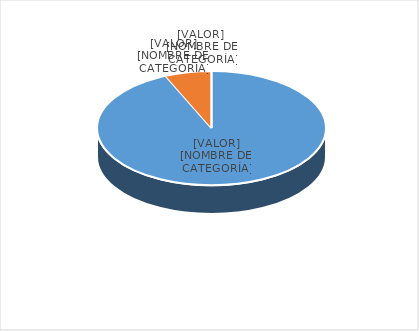
| Category | Series 0 |
|---|---|
| PRESUPUESTO VIGENTE PARA 2023 | 31000000 |
| PRESUPUESTO EJECUTADO  | 2181732.91 |
| PORCENTAJE DE EJECUCIÓN  | 0.07 |